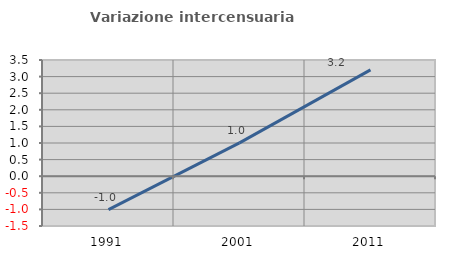
| Category | Variazione intercensuaria annua |
|---|---|
| 1991.0 | -1.006 |
| 2001.0 | 1.003 |
| 2011.0 | 3.204 |